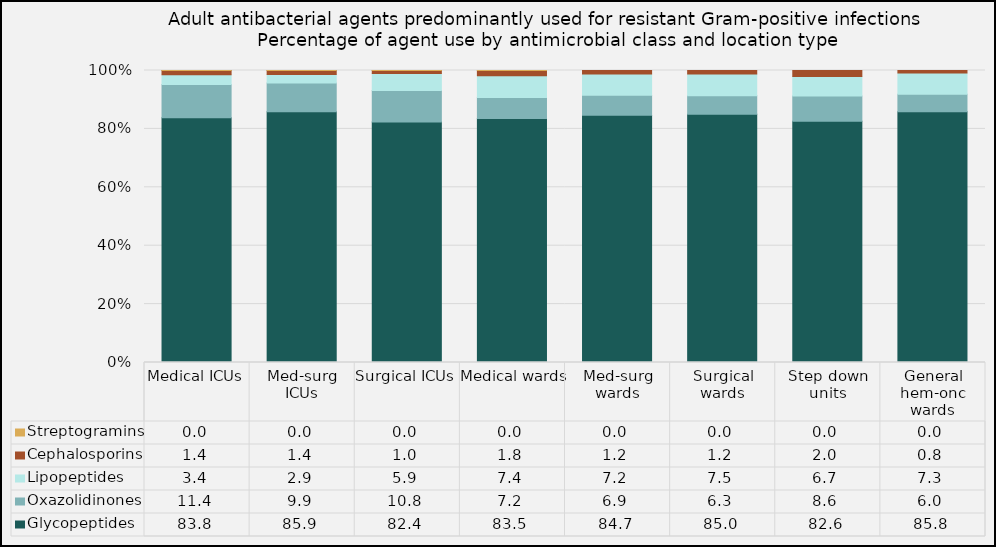
| Category | Glycopeptides | Oxazolidinones | Lipopeptides | Cephalosporins | Streptogramins |
|---|---|---|---|---|---|
| Medical ICUs | 83.8 | 11.38 | 3.38 | 1.42 | 0.01 |
| Med-surg ICUs | 85.87 | 9.85 | 2.9 | 1.36 | 0.02 |
| Surgical ICUs | 82.36 | 10.77 | 5.87 | 1 | 0.01 |
| Medical wards | 83.52 | 7.23 | 7.42 | 1.81 | 0.02 |
| Med-surg wards | 84.68 | 6.89 | 7.2 | 1.24 | 0 |
| Surgical wards | 84.99 | 6.33 | 7.51 | 1.17 | 0 |
| Step down units | 82.64 | 8.61 | 6.71 | 2.04 | 0 |
| General hem-onc wards | 85.84 | 6.02 | 7.32 | 0.82 | 0 |